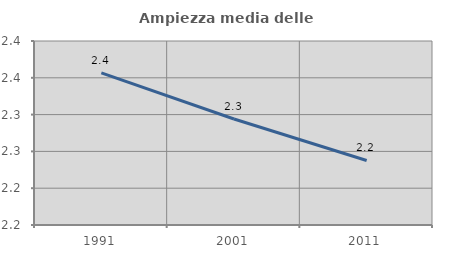
| Category | Ampiezza media delle famiglie |
|---|---|
| 1991.0 | 2.357 |
| 2001.0 | 2.294 |
| 2011.0 | 2.238 |